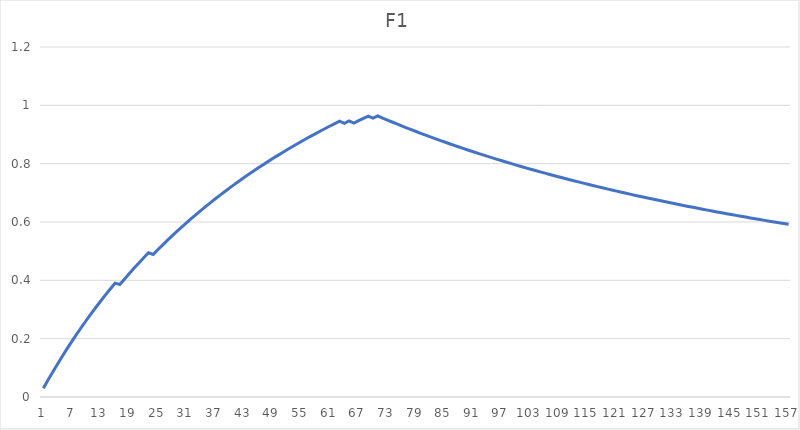
| Category | F1 |
|---|---|
| 0 | 0.03 |
| 1 | 0.059 |
| 2 | 0.087 |
| 3 | 0.114 |
| 4 | 0.141 |
| 5 | 0.167 |
| 6 | 0.192 |
| 7 | 0.216 |
| 8 | 0.24 |
| 9 | 0.263 |
| 10 | 0.286 |
| 11 | 0.308 |
| 12 | 0.329 |
| 13 | 0.35 |
| 14 | 0.37 |
| 15 | 0.39 |
| 16 | 0.386 |
| 17 | 0.405 |
| 18 | 0.424 |
| 19 | 0.442 |
| 20 | 0.46 |
| 21 | 0.477 |
| 22 | 0.494 |
| 23 | 0.489 |
| 24 | 0.505 |
| 25 | 0.522 |
| 26 | 0.538 |
| 27 | 0.553 |
| 28 | 0.568 |
| 29 | 0.583 |
| 30 | 0.598 |
| 31 | 0.612 |
| 32 | 0.626 |
| 33 | 0.64 |
| 34 | 0.653 |
| 35 | 0.667 |
| 36 | 0.68 |
| 37 | 0.692 |
| 38 | 0.705 |
| 39 | 0.717 |
| 40 | 0.729 |
| 41 | 0.741 |
| 42 | 0.752 |
| 43 | 0.764 |
| 44 | 0.775 |
| 45 | 0.786 |
| 46 | 0.796 |
| 47 | 0.807 |
| 48 | 0.817 |
| 49 | 0.828 |
| 50 | 0.838 |
| 51 | 0.847 |
| 52 | 0.857 |
| 53 | 0.867 |
| 54 | 0.876 |
| 55 | 0.885 |
| 56 | 0.894 |
| 57 | 0.903 |
| 58 | 0.912 |
| 59 | 0.921 |
| 60 | 0.929 |
| 61 | 0.938 |
| 62 | 0.946 |
| 63 | 0.938 |
| 64 | 0.947 |
| 65 | 0.939 |
| 66 | 0.947 |
| 67 | 0.955 |
| 68 | 0.963 |
| 69 | 0.956 |
| 70 | 0.964 |
| 71 | 0.957 |
| 72 | 0.95 |
| 73 | 0.943 |
| 74 | 0.936 |
| 75 | 0.93 |
| 76 | 0.923 |
| 77 | 0.917 |
| 78 | 0.91 |
| 79 | 0.904 |
| 80 | 0.898 |
| 81 | 0.892 |
| 82 | 0.886 |
| 83 | 0.88 |
| 84 | 0.874 |
| 85 | 0.868 |
| 86 | 0.863 |
| 87 | 0.857 |
| 88 | 0.852 |
| 89 | 0.846 |
| 90 | 0.841 |
| 91 | 0.835 |
| 92 | 0.83 |
| 93 | 0.825 |
| 94 | 0.82 |
| 95 | 0.815 |
| 96 | 0.81 |
| 97 | 0.805 |
| 98 | 0.8 |
| 99 | 0.795 |
| 100 | 0.79 |
| 101 | 0.786 |
| 102 | 0.781 |
| 103 | 0.776 |
| 104 | 0.772 |
| 105 | 0.767 |
| 106 | 0.763 |
| 107 | 0.759 |
| 108 | 0.754 |
| 109 | 0.75 |
| 110 | 0.746 |
| 111 | 0.742 |
| 112 | 0.737 |
| 113 | 0.733 |
| 114 | 0.729 |
| 115 | 0.725 |
| 116 | 0.721 |
| 117 | 0.717 |
| 118 | 0.714 |
| 119 | 0.71 |
| 120 | 0.706 |
| 121 | 0.702 |
| 122 | 0.698 |
| 123 | 0.695 |
| 124 | 0.691 |
| 125 | 0.688 |
| 126 | 0.684 |
| 127 | 0.68 |
| 128 | 0.677 |
| 129 | 0.673 |
| 130 | 0.67 |
| 131 | 0.667 |
| 132 | 0.663 |
| 133 | 0.66 |
| 134 | 0.657 |
| 135 | 0.653 |
| 136 | 0.65 |
| 137 | 0.647 |
| 138 | 0.644 |
| 139 | 0.641 |
| 140 | 0.638 |
| 141 | 0.635 |
| 142 | 0.632 |
| 143 | 0.629 |
| 144 | 0.626 |
| 145 | 0.623 |
| 146 | 0.62 |
| 147 | 0.617 |
| 148 | 0.614 |
| 149 | 0.611 |
| 150 | 0.608 |
| 151 | 0.606 |
| 152 | 0.603 |
| 153 | 0.6 |
| 154 | 0.597 |
| 155 | 0.595 |
| 156 | 0.592 |